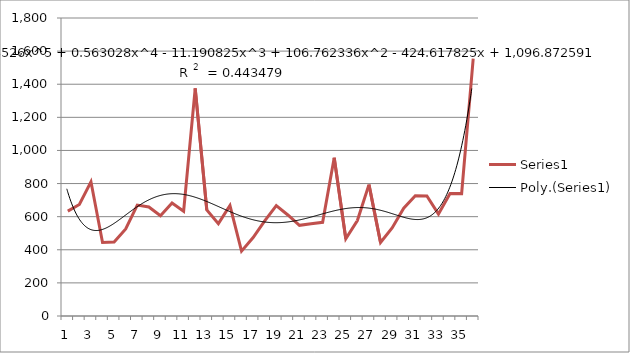
| Category | Series 1 |
|---|---|
| 0 | 633.648 |
| 1 | 673.572 |
| 2 | 810.372 |
| 3 | 444.42 |
| 4 | 446.736 |
| 5 | 525.54 |
| 6 | 669.96 |
| 7 | 658.572 |
| 8 | 605.65 |
| 9 | 682.777 |
| 10 | 633.019 |
| 11 | 1374.508 |
| 12 | 640.283 |
| 13 | 557.873 |
| 14 | 667.309 |
| 15 | 391.668 |
| 16 | 473.71 |
| 17 | 574.637 |
| 18 | 667.068 |
| 19 | 610.095 |
| 20 | 547.738 |
| 21 | 557.835 |
| 22 | 566.09 |
| 23 | 955.78 |
| 24 | 466.59 |
| 25 | 576.667 |
| 26 | 793.615 |
| 27 | 444.061 |
| 28 | 531.656 |
| 29 | 650.98 |
| 30 | 726.696 |
| 31 | 725.006 |
| 32 | 615.871 |
| 33 | 740.106 |
| 34 | 739.208 |
| 35 | 1554.95 |